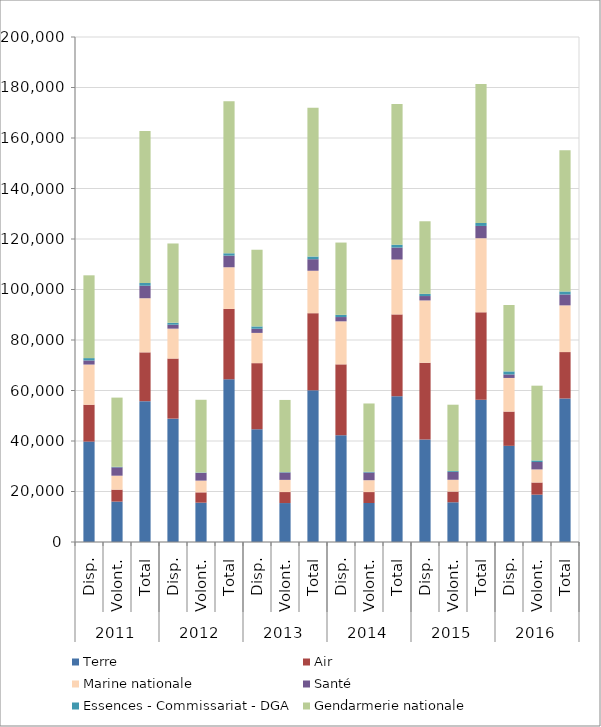
| Category | Terre | Air | Marine nationale | Santé | Essences - Commissariat - DGA | Gendarmerie nationale |
|---|---|---|---|---|---|---|
| 0 | 39765 | 14601 | 15914 | 1624 | 926 | 32786 |
| 1 | 16006 | 4737 | 5519 | 3326 | 188 | 27411 |
| 2 | 55771 | 19338 | 21433 | 4950 | 1114 | 60197 |
| 3 | 48855 | 23806 | 11836 | 1567 | 765 | 31398 |
| 4 | 15582 | 4081 | 4651 | 3034 | 170 | 28810 |
| 5 | 64437 | 27887 | 16487 | 4601 | 935 | 60208 |
| 6 | 44648 | 26183 | 11983 | 1657 | 909 | 30367 |
| 7 | 15425 | 4356 | 4827 | 2921 | 151 | 28582 |
| 8 | 60073 | 30539 | 16810 | 4578 | 1060 | 58949 |
| 9 | 42283 | 28070 | 17047 | 1693 | 865 | 28634 |
| 10 | 15453 | 4324 | 4696 | 3056 | 256 | 27075 |
| 11 | 57736 | 32394 | 21743 | 4749 | 1121 | 55709 |
| 12 | 40602 | 30377 | 24689 | 1742 | 859 | 28753 |
| 13 | 15734 | 4239 | 4671 | 3118 | 338 | 26274 |
| 14 | 56336 | 34616 | 29360 | 4860 | 1197 | 55027 |
| 15 | 38087 | 13567 | 13313 | 1394 | 1211 | 26289 |
| 16 | 18751 | 4815 | 5181 | 2927 | 629 | 29607 |
| 17 | 56838 | 18382 | 18494 | 4321 | 1197 | 55896 |